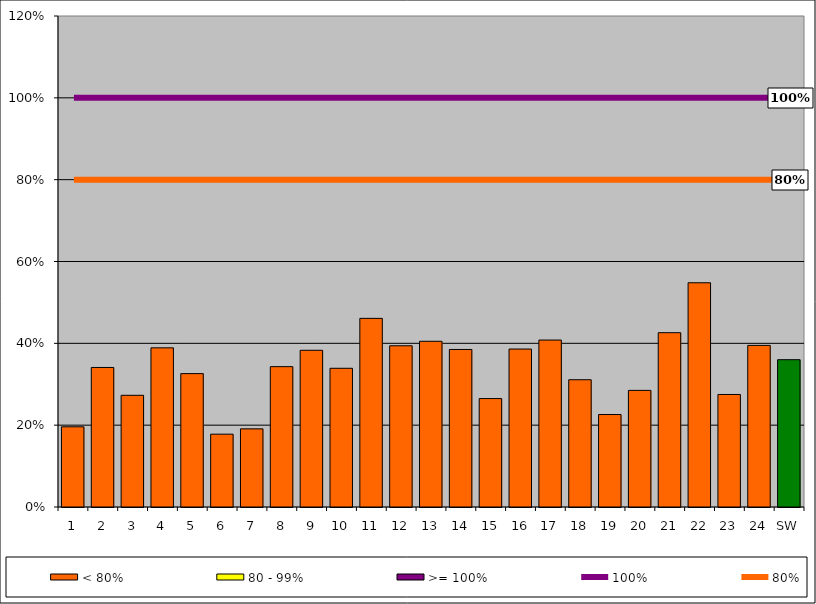
| Category | < 80% | 80 - 99% | >= 100% |
|---|---|---|---|
| 1 | 0.196 | 0 | 0 |
| 2 | 0.341 | 0 | 0 |
| 3 | 0.273 | 0 | 0 |
| 4 | 0.389 | 0 | 0 |
| 5 | 0.326 | 0 | 0 |
| 6 | 0.178 | 0 | 0 |
| 7 | 0.191 | 0 | 0 |
| 8 | 0.343 | 0 | 0 |
| 9 | 0.383 | 0 | 0 |
| 10 | 0.339 | 0 | 0 |
| 11 | 0.461 | 0 | 0 |
| 12 | 0.394 | 0 | 0 |
| 13 | 0.405 | 0 | 0 |
| 14 | 0.385 | 0 | 0 |
| 15 | 0.265 | 0 | 0 |
| 16 | 0.386 | 0 | 0 |
| 17 | 0.408 | 0 | 0 |
| 18 | 0.311 | 0 | 0 |
| 19 | 0.226 | 0 | 0 |
| 20 | 0.285 | 0 | 0 |
| 21 | 0.426 | 0 | 0 |
| 22 | 0.548 | 0 | 0 |
| 23 | 0.275 | 0 | 0 |
| 24 | 0.395 | 0 | 0 |
| SW | 0.36 | 0 | 0 |